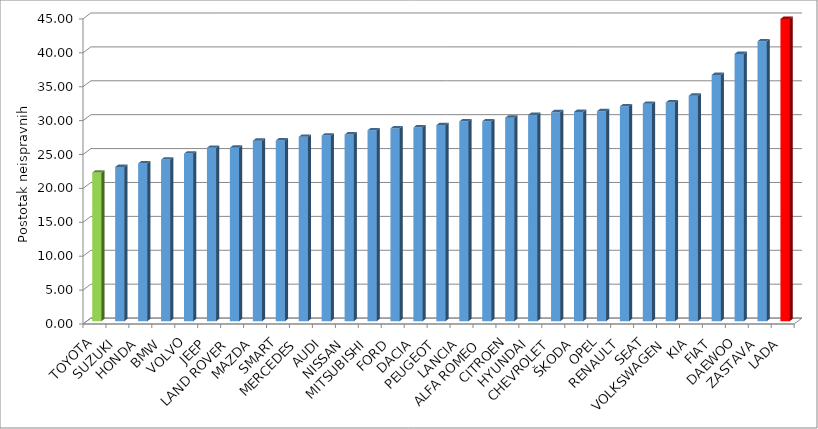
| Category | Series 4 |
|---|---|
| TOYOTA | 21.927 |
| SUZUKI | 22.751 |
| HONDA | 23.272 |
| BMW | 23.837 |
| VOLVO | 24.721 |
| JEEP | 25.58 |
| LAND ROVER | 25.594 |
| MAZDA | 26.626 |
| SMART | 26.658 |
| MERCEDES | 27.197 |
| AUDI | 27.38 |
| NISSAN | 27.539 |
| MITSUBISHI | 28.156 |
| FORD | 28.442 |
| DACIA | 28.59 |
| PEUGEOT | 28.922 |
| LANCIA | 29.479 |
| ALFA ROMEO | 29.486 |
| CITROEN | 30.014 |
| HYUNDAI | 30.42 |
| CHEVROLET | 30.833 |
| ŠKODA | 30.874 |
| OPEL | 30.973 |
| RENAULT | 31.7 |
| SEAT | 32.074 |
| VOLKSWAGEN | 32.271 |
| KIA | 33.268 |
| FIAT | 36.325 |
| DAEWOO | 39.431 |
| ZASTAVA | 41.294 |
| LADA | 44.591 |